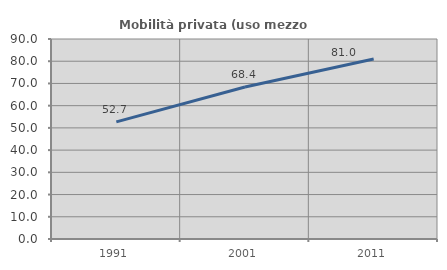
| Category | Mobilità privata (uso mezzo privato) |
|---|---|
| 1991.0 | 52.711 |
| 2001.0 | 68.399 |
| 2011.0 | 80.977 |